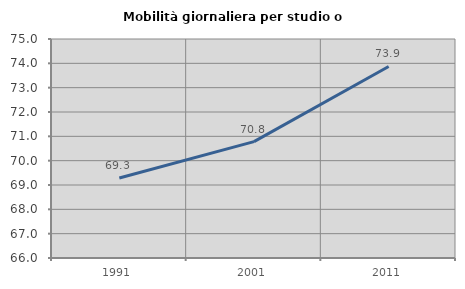
| Category | Mobilità giornaliera per studio o lavoro |
|---|---|
| 1991.0 | 69.29 |
| 2001.0 | 70.784 |
| 2011.0 | 73.871 |